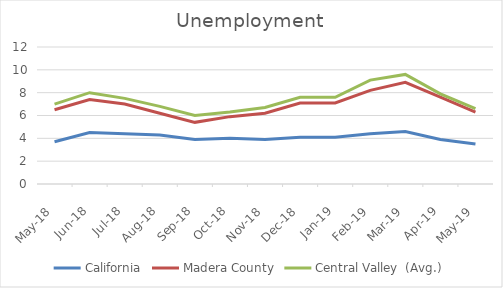
| Category | California | Madera County | Central Valley  (Avg.) |
|---|---|---|---|
| 2018-05-01 | 3.7 | 6.5 | 7 |
| 2018-06-01 | 4.5 | 7.4 | 8 |
| 2018-07-01 | 4.4 | 7 | 7.5 |
| 2018-08-01 | 4.3 | 6.2 | 6.8 |
| 2018-09-01 | 3.9 | 5.4 | 6 |
| 2018-10-01 | 4 | 5.9 | 6.3 |
| 2018-11-01 | 3.9 | 6.2 | 6.7 |
| 2018-12-01 | 4.1 | 7.1 | 7.6 |
| 2019-01-01 | 4.1 | 7.1 | 7.6 |
| 2019-02-01 | 4.4 | 8.2 | 9.1 |
| 2019-03-01 | 4.6 | 8.9 | 9.6 |
| 2019-04-01 | 3.9 | 7.6 | 7.9 |
| 2019-05-01 | 3.5 | 6.3 | 6.6 |